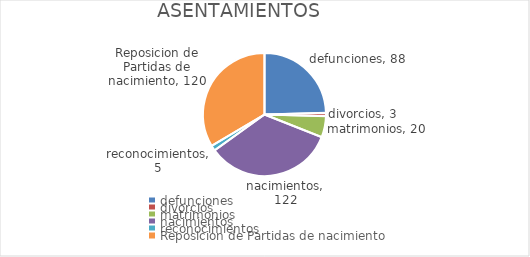
| Category | Series 0 |
|---|---|
| defunciones | 88 |
| divorcios | 3 |
| matrimonios | 20 |
| nacimientos | 122 |
| reconocimientos | 5 |
| Reposicion de Partidas de nacimiento | 120 |